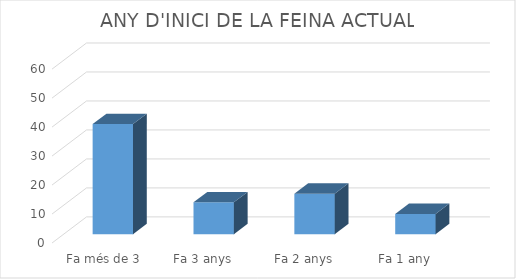
| Category | Series 0 |
|---|---|
| Fa més de 3 anys | 38 |
| Fa 3 anys | 11 |
| Fa 2 anys | 14 |
| Fa 1 any | 7 |